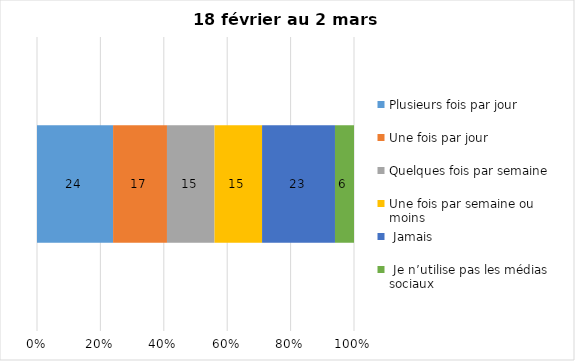
| Category | Plusieurs fois par jour | Une fois par jour | Quelques fois par semaine   | Une fois par semaine ou moins   |  Jamais   |  Je n’utilise pas les médias sociaux |
|---|---|---|---|---|---|---|
| 0 | 24 | 17 | 15 | 15 | 23 | 6 |